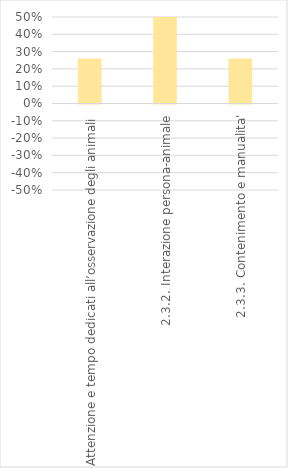
| Category | Series 0 |
|---|---|
| 2.3.1. Attenzione e tempo dedicati all’osservazione degli animali | 0.26 |
| 2.3.2. Interazione persona-animale | 0.51 |
| 2.3.3. Contenimento e manualita' | 0.26 |